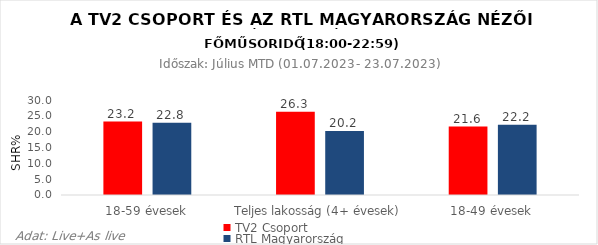
| Category | TV2 Csoport | RTL Magyarország |
|---|---|---|
| 18-59 évesek | 23.2 | 22.8 |
| Teljes lakosság (4+ évesek) | 26.3 | 20.2 |
| 18-49 évesek | 21.6 | 22.2 |